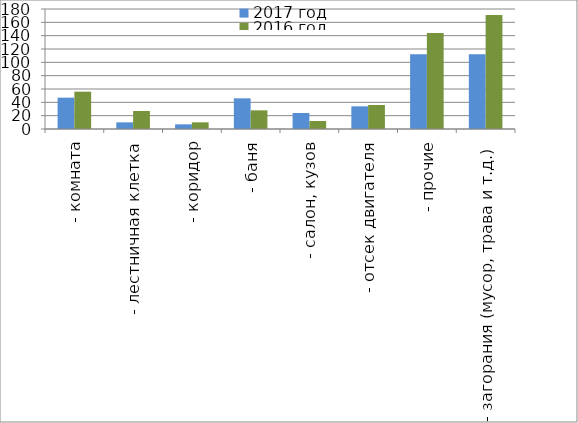
| Category | 2017 год | 2016 год |
|---|---|---|
|  - комната | 47 | 56 |
|  - лестничная клетка | 10 | 27 |
|  - коридор | 7 | 10 |
|  - баня | 46 | 28 |
|  - салон, кузов | 24 | 12 |
|  - отсек двигателя | 34 | 36 |
| - прочие | 112 | 144 |
| - загорания (мусор, трава и т.д.)  | 112 | 171 |